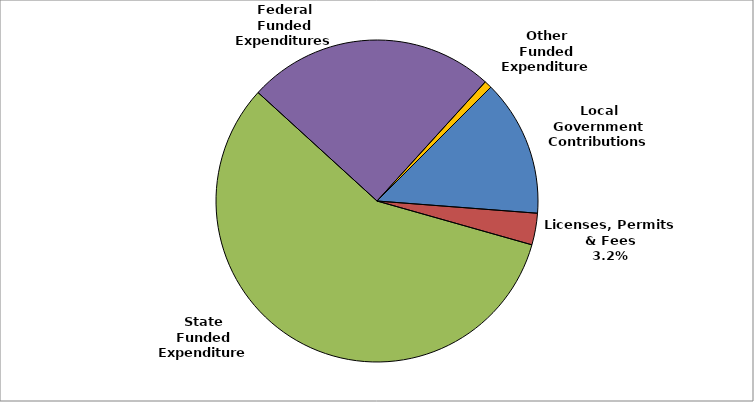
| Category | Series 0 |
|---|---|
| Local Government Contributions | 0.137 |
| Licenses, Permits & Fees | 0.032 |
| State Funded Expenditures | 0.574 |
| Federal Funded Expenditures | 0.25 |
| Other Funded Expenditures | 0.008 |